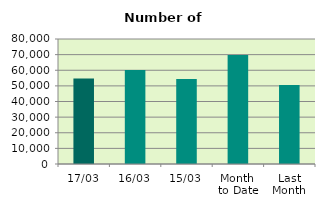
| Category | Series 0 |
|---|---|
| 17/03 | 54680 |
| 16/03 | 60194 |
| 15/03 | 54386 |
| Month 
to Date | 69796.769 |
| Last
Month | 50484.7 |